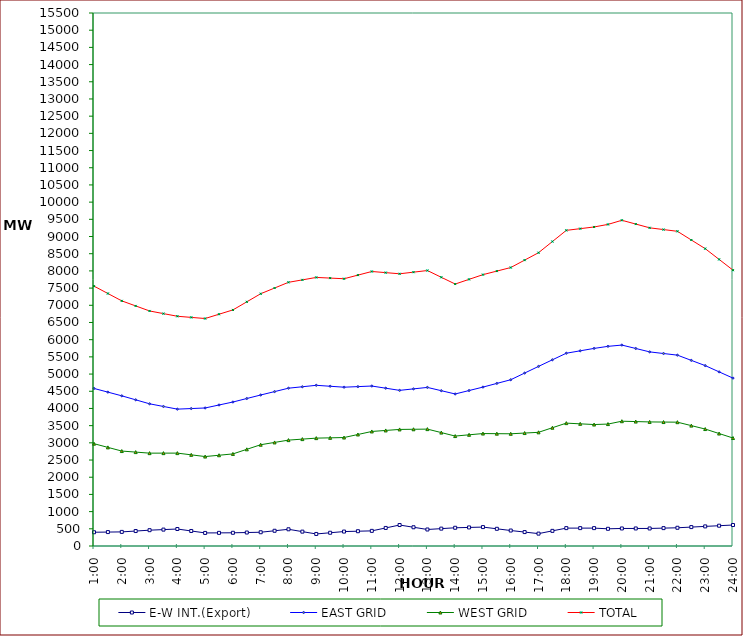
| Category | E-W INT.(Export) | EAST GRID | WEST GRID | TOTAL |
|---|---|---|---|---|
| 1:00 | 400 | 4582 | 2975 | 7557 |
| 1:30 | 405 | 4474.5 | 2868 | 7342.5 |
| 2:00 | 410 | 4367 | 2761 | 7128 |
| 2:30 | 435 | 4251 | 2730.5 | 6981.5 |
| 3:00 | 460 | 4135 | 2700 | 6835 |
| 3:30 | 477 | 4057.5 | 2700.5 | 6758 |
| 4:00 | 494 | 3980 | 2701 | 6681 |
| 4:30 | 437 | 3997 | 2651 | 6648 |
| 5:00 | 380 | 4014 | 2601 | 6615 |
| 5:30 | 382 | 4100.5 | 2639.5 | 6740 |
| 6:00 | 384 | 4187 | 2678 | 6865 |
| 6:30 | 392 | 4289 | 2811.5 | 7100.5 |
| 7:00 | 400 | 4391 | 2945 | 7336 |
| 7:30 | 443 | 4490 | 3012 | 7502 |
| 8:00 | 486 | 4589 | 3079 | 7668 |
| 8:30 | 418 | 4631 | 3108 | 7739 |
| 9:00 | 350 | 4673 | 3137 | 7810 |
| 9:30 | 385 | 4645.5 | 3145.5 | 7791 |
| 10:00 | 420 | 4618 | 3154 | 7772 |
| 10:30 | 430 | 4635 | 3242.5 | 7877.5 |
| 11:00 | 440 | 4652 | 3331 | 7983 |
| 11:30 | 525 | 4589 | 3360.5 | 7949.5 |
| 12:00 | 610 | 4526 | 3390 | 7916 |
| 12:30 | 545 | 4569 | 3394.5 | 7963.5 |
| 13:00 | 480 | 4612 | 3399 | 8011 |
| 13:30 | 505 | 4516.5 | 3298 | 7814.5 |
| 14:00 | 530 | 4421 | 3197 | 7618 |
| 14:30 | 540 | 4521 | 3233.5 | 7754.5 |
| 15:00 | 550 | 4621 | 3270 | 7891 |
| 15:30 | 500 | 4728 | 3266.5 | 7994.5 |
| 16:00 | 450 | 4835 | 3263 | 8098 |
| 16:30 | 405 | 5029 | 3284.5 | 8313.5 |
| 17:00 | 360 | 5223 | 3306 | 8529 |
| 17:30 | 440 | 5414.5 | 3439.5 | 8854 |
| 18:00 | 520 | 5606 | 3573 | 9179 |
| 18:30 | 520 | 5676 | 3552.5 | 9228.5 |
| 19:00 | 520 | 5746 | 3532 | 9278 |
| 19:30 | 500 | 5806 | 3546 | 9352 |
| 20:00 | 510 | 5843 | 3629 | 9472 |
| 20:30 | 510 | 5744 | 3618.5 | 9362.5 |
| 21:00 | 510 | 5645 | 3608 | 9253 |
| 21:30 | 520 | 5597.5 | 3604.5 | 9202 |
| 22:00 | 530 | 5550 | 3601 | 9151 |
| 22:30 | 550 | 5398 | 3501 | 8899 |
| 23:00 | 570 | 5246 | 3401 | 8647 |
| 23:30 | 590 | 5064 | 3270.5 | 8334.5 |
| 24:00 | 610 | 4882 | 3140 | 8022 |